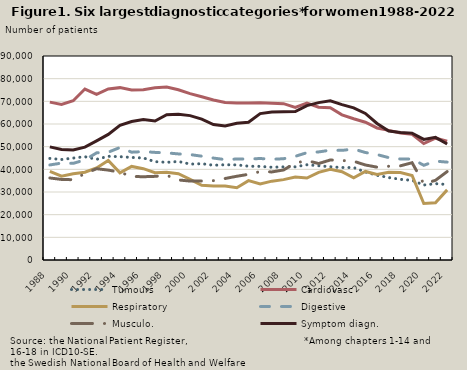
| Category | Tumours | Cardiovasc | Respiratory | Digestive | Musculo. | Symptom diagn.  |
|---|---|---|---|---|---|---|
| 1988.0 | 44809 | 69664 | 39076 | 41938 | 36184 | 49911 |
| 1989.0 | 44341 | 68597 | 36987 | 42750 | 35545 | 48765 |
| 1990.0 | 44972 | 70267 | 38016 | 42633 | 35418 | 48544 |
| 1991.0 | 45579 | 75432 | 38719 | 44173 | 38123 | 49811 |
| 1992.0 | 44402 | 73045 | 40587 | 47266 | 40267 | 52544 |
| 1993.0 | 45754 | 75491 | 43939 | 47562 | 39668 | 55414 |
| 1994.0 | 45583 | 76043 | 38474 | 49639 | 38708 | 59460 |
| 1995.0 | 45238 | 75000 | 41290 | 47570 | 36880 | 61108 |
| 1996.0 | 45013 | 75079 | 40287 | 47823 | 36735 | 61932 |
| 1997.0 | 43388 | 75985 | 38530 | 47478 | 36906 | 61293 |
| 1998.0 | 43084 | 76307 | 38697 | 47258 | 37352 | 64067 |
| 1999.0 | 43477 | 75106 | 38053 | 46805 | 35324 | 64278 |
| 2000.0 | 42308 | 73423 | 35601 | 46523 | 34817 | 63700 |
| 2001.0 | 42478 | 72032 | 32980 | 45798 | 34852 | 62159 |
| 2002.0 | 41807 | 70563 | 32647 | 44967 | 35016 | 59749 |
| 2003.0 | 42019 | 69456 | 32652 | 44301 | 35959 | 59113 |
| 2004.0 | 41955 | 69268 | 31877 | 44556 | 36951 | 60322 |
| 2005.0 | 41377 | 69289 | 35020 | 44560 | 37789 | 60782 |
| 2006.0 | 41298 | 69405 | 33516 | 44775 | 39009 | 64592 |
| 2007.0 | 40928 | 69202 | 34785 | 44440 | 38860 | 65267 |
| 2008.0 | 41094 | 68960 | 35458 | 44682 | 39717 | 65387 |
| 2009.0 | 41101 | 67331 | 36633 | 45748 | 42770 | 65492 |
| 2010.0 | 42011 | 69235 | 36166 | 47343 | 43862 | 68133 |
| 2011.0 | 41574 | 67403 | 38668 | 47686 | 42552 | 69431 |
| 2012.0 | 41129 | 67160 | 40029 | 48436 | 44127 | 70222 |
| 2013.0 | 40811 | 64056 | 38961 | 48363 | 43905 | 68540 |
| 2014.0 | 40789 | 62314 | 36269 | 48941 | 43556 | 67090 |
| 2015.0 | 38820 | 60780 | 39070 | 47423 | 41920 | 64668 |
| 2016.0 | 37380 | 58253 | 37721 | 46504 | 40957 | 60233 |
| 2017.0 | 36369 | 57199 | 38715 | 45166 | 41353 | 56925 |
| 2018.0 | 35583 | 56002 | 38592 | 44544 | 41551 | 56236 |
| 2019.0 | 35149 | 55496 | 37311 | 44572 | 42915 | 55979 |
| 2020.0 | 33087 | 51350 | 24919 | 41789 | 33594 | 53207 |
| 2021.0 | 33668 | 53736 | 25222 | 43610 | 35150 | 54118 |
| 2022.0 | 33320 | 52367 | 30938 | 43182 | 39001 | 51166 |